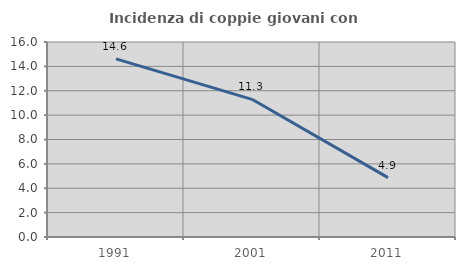
| Category | Incidenza di coppie giovani con figli |
|---|---|
| 1991.0 | 14.62 |
| 2001.0 | 11.297 |
| 2011.0 | 4.869 |